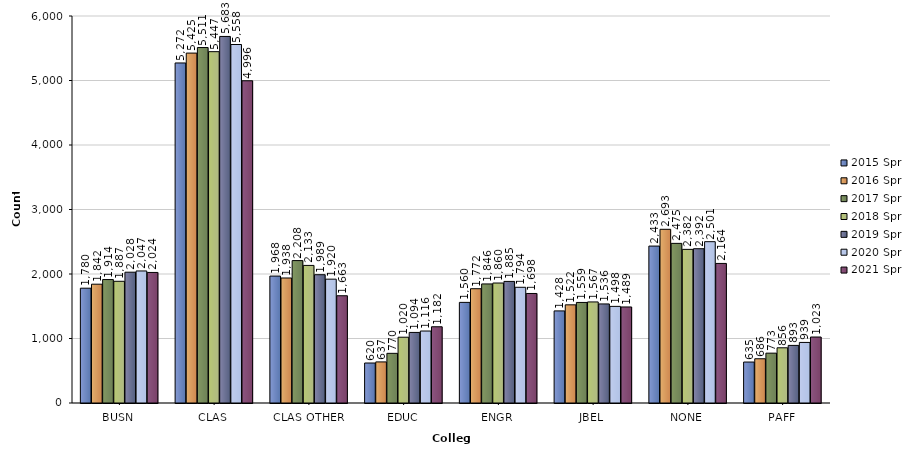
| Category | 2015 Spr | 2016 Spr | 2017 Spr | 2018 Spr | 2019 Spr | 2020 Spr | 2021 Spr |
|---|---|---|---|---|---|---|---|
| BUSN | 1780 | 1842 | 1914 | 1887 | 2028 | 2047 | 2024 |
| CLAS | 5272 | 5425 | 5511 | 5447 | 5683 | 5558 | 4996 |
| CLAS OTHER | 1968 | 1938 | 2208 | 2133 | 1989 | 1920 | 1663 |
| EDUC | 620 | 637 | 770 | 1020 | 1094 | 1116 | 1182 |
| ENGR | 1560 | 1772 | 1846 | 1860 | 1885 | 1794 | 1698 |
| JBEL | 1428 | 1522 | 1559 | 1567 | 1536 | 1498 | 1489 |
| NONE | 2433 | 2693 | 2475 | 2382 | 2392 | 2501 | 2164 |
| PAFF | 635 | 686 | 773 | 856 | 893 | 939 | 1023 |